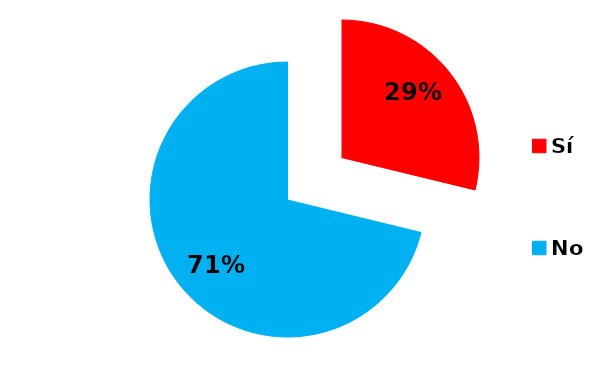
| Category | Series 0 |
|---|---|
| Sí | 38 |
| No | 94 |